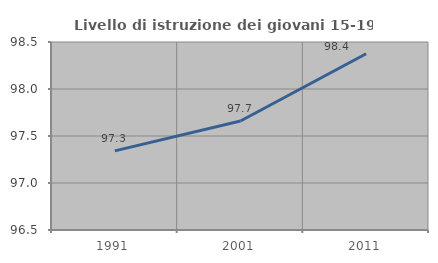
| Category | Livello di istruzione dei giovani 15-19 anni |
|---|---|
| 1991.0 | 97.341 |
| 2001.0 | 97.66 |
| 2011.0 | 98.375 |